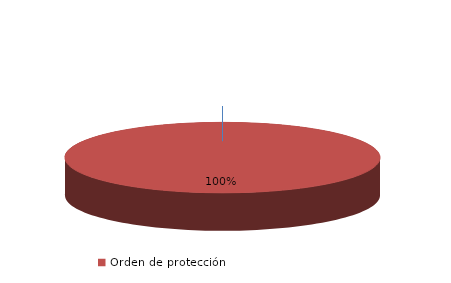
| Category | Series 0 |
|---|---|
| Orden de alejamiento | 0 |
| Orden de protección | 379 |